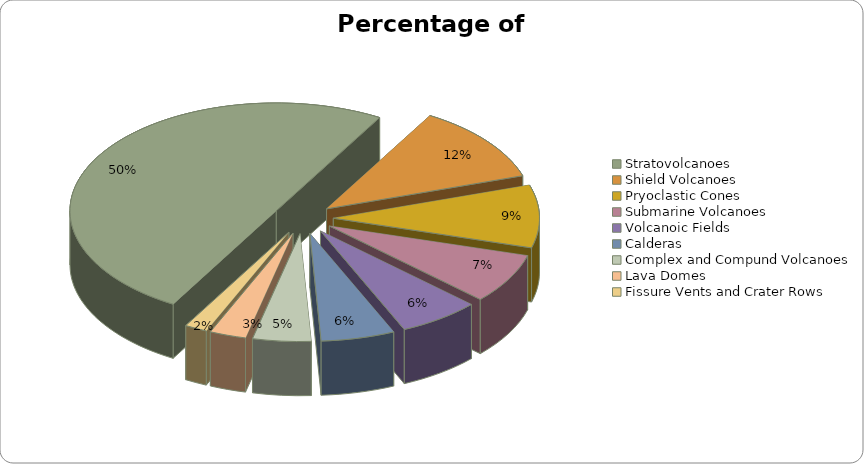
| Category | Percentage of Volcanoes |
|---|---|
| Stratovolcanoes | 734 |
| Shield Volcanoes | 171 |
| Pryoclastic Cones | 138 |
| Submarine Volcanoes | 110 |
| Volcanoic Fields | 94 |
| Calderas | 85 |
| Complex and Compund Volcanoes | 67 |
| Lava Domes | 42 |
| Fissure Vents and Crater Rows | 26 |